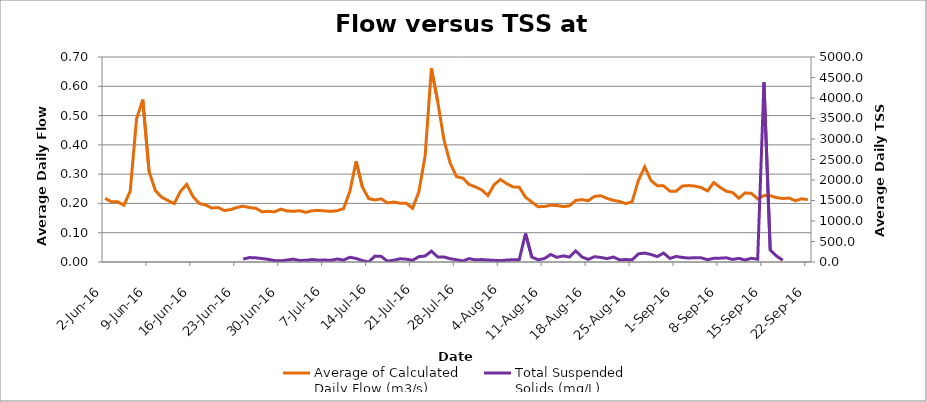
| Category | Average of Calculated 
Daily Flow (m3/s) |
|---|---|
| 2016-06-02 | 0.217 |
| 2016-06-03 | 0.205 |
| 2016-06-04 | 0.205 |
| 2016-06-05 | 0.194 |
| 2016-06-06 | 0.242 |
| 2016-06-07 | 0.488 |
| 2016-06-08 | 0.554 |
| 2016-06-09 | 0.309 |
| 2016-06-10 | 0.244 |
| 2016-06-11 | 0.221 |
| 2016-06-12 | 0.21 |
| 2016-06-13 | 0.199 |
| 2016-06-14 | 0.241 |
| 2016-06-15 | 0.265 |
| 2016-06-16 | 0.223 |
| 2016-06-17 | 0.2 |
| 2016-06-18 | 0.195 |
| 2016-06-19 | 0.184 |
| 2016-06-20 | 0.186 |
| 2016-06-21 | 0.176 |
| 2016-06-22 | 0.179 |
| 2016-06-23 | 0.186 |
| 2016-06-24 | 0.191 |
| 2016-06-25 | 0.186 |
| 2016-06-26 | 0.184 |
| 2016-06-27 | 0.171 |
| 2016-06-28 | 0.173 |
| 2016-06-29 | 0.171 |
| 2016-06-30 | 0.18 |
| 2016-07-01 | 0.175 |
| 2016-07-02 | 0.173 |
| 2016-07-03 | 0.175 |
| 2016-07-04 | 0.17 |
| 2016-07-05 | 0.175 |
| 2016-07-06 | 0.176 |
| 2016-07-07 | 0.174 |
| 2016-07-08 | 0.173 |
| 2016-07-09 | 0.175 |
| 2016-07-10 | 0.182 |
| 2016-07-11 | 0.241 |
| 2016-07-12 | 0.344 |
| 2016-07-13 | 0.256 |
| 2016-07-14 | 0.217 |
| 2016-07-15 | 0.212 |
| 2016-07-16 | 0.216 |
| 2016-07-17 | 0.202 |
| 2016-07-18 | 0.205 |
| 2016-07-19 | 0.2 |
| 2016-07-20 | 0.2 |
| 2016-07-21 | 0.184 |
| 2016-07-22 | 0.24 |
| 2016-07-23 | 0.362 |
| 2016-07-24 | 0.661 |
| 2016-07-25 | 0.549 |
| 2016-07-26 | 0.417 |
| 2016-07-27 | 0.337 |
| 2016-07-28 | 0.291 |
| 2016-07-29 | 0.286 |
| 2016-07-30 | 0.265 |
| 2016-07-31 | 0.257 |
| 2016-08-01 | 0.246 |
| 2016-08-02 | 0.227 |
| 2016-08-03 | 0.264 |
| 2016-08-04 | 0.282 |
| 2016-08-05 | 0.268 |
| 2016-08-06 | 0.256 |
| 2016-08-07 | 0.255 |
| 2016-08-08 | 0.221 |
| 2016-08-09 | 0.205 |
| 2016-08-10 | 0.189 |
| 2016-08-11 | 0.19 |
| 2016-08-12 | 0.194 |
| 2016-08-13 | 0.193 |
| 2016-08-14 | 0.189 |
| 2016-08-15 | 0.192 |
| 2016-08-16 | 0.21 |
| 2016-08-17 | 0.213 |
| 2016-08-18 | 0.209 |
| 2016-08-19 | 0.224 |
| 2016-08-20 | 0.226 |
| 2016-08-21 | 0.217 |
| 2016-08-22 | 0.21 |
| 2016-08-23 | 0.207 |
| 2016-08-24 | 0.199 |
| 2016-08-25 | 0.207 |
| 2016-08-26 | 0.279 |
| 2016-08-27 | 0.325 |
| 2016-08-28 | 0.278 |
| 2016-08-29 | 0.261 |
| 2016-08-30 | 0.26 |
| 2016-08-31 | 0.242 |
| 2016-09-01 | 0.242 |
| 2016-09-02 | 0.26 |
| 2016-09-03 | 0.261 |
| 2016-09-04 | 0.259 |
| 2016-09-05 | 0.254 |
| 2016-09-06 | 0.243 |
| 2016-09-07 | 0.271 |
| 2016-09-08 | 0.255 |
| 2016-09-09 | 0.242 |
| 2016-09-10 | 0.237 |
| 2016-09-11 | 0.218 |
| 2016-09-12 | 0.236 |
| 2016-09-13 | 0.234 |
| 2016-09-14 | 0.215 |
| 2016-09-15 | 0.227 |
| 2016-09-16 | 0.227 |
| 2016-09-17 | 0.22 |
| 2016-09-18 | 0.217 |
| 2016-09-19 | 0.218 |
| 2016-09-20 | 0.209 |
| 2016-09-21 | 0.216 |
| 2016-09-22 | 0.213 |